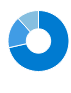
| Category | Series 0 |
|---|---|
| Payroll accounts | 621.754 |
| Pooling schemes | 146.775 |
| Time deposits | 101.316 |